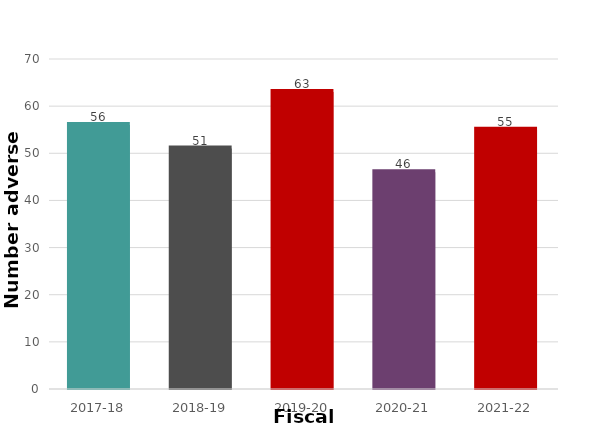
| Category | Number adverse reactions |
|---|---|
| 2017-18 | 56 |
| 2018-19 | 51 |
| 2019-20 | 63 |
| 2020-21 | 46 |
| 2021-22 | 55 |